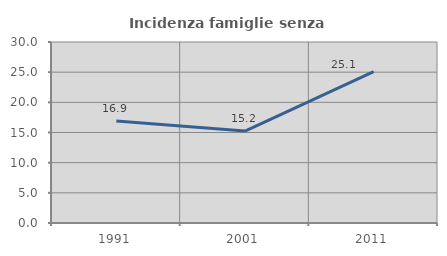
| Category | Incidenza famiglie senza nuclei |
|---|---|
| 1991.0 | 16.923 |
| 2001.0 | 15.232 |
| 2011.0 | 25.076 |